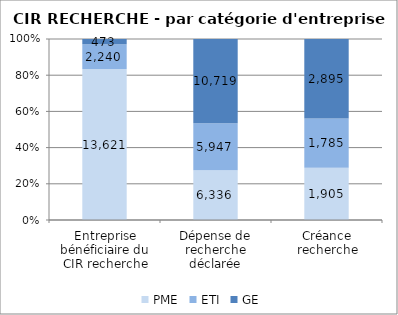
| Category | PME | ETI | GE |
|---|---|---|---|
| Entreprise bénéficiaire du CIR recherche | 13621 | 2240 | 473 |
| Dépense de recherche déclarée | 6335.61 | 5947.4 | 10718.72 |
| Créance recherche | 1904.9 | 1785.46 | 2895 |